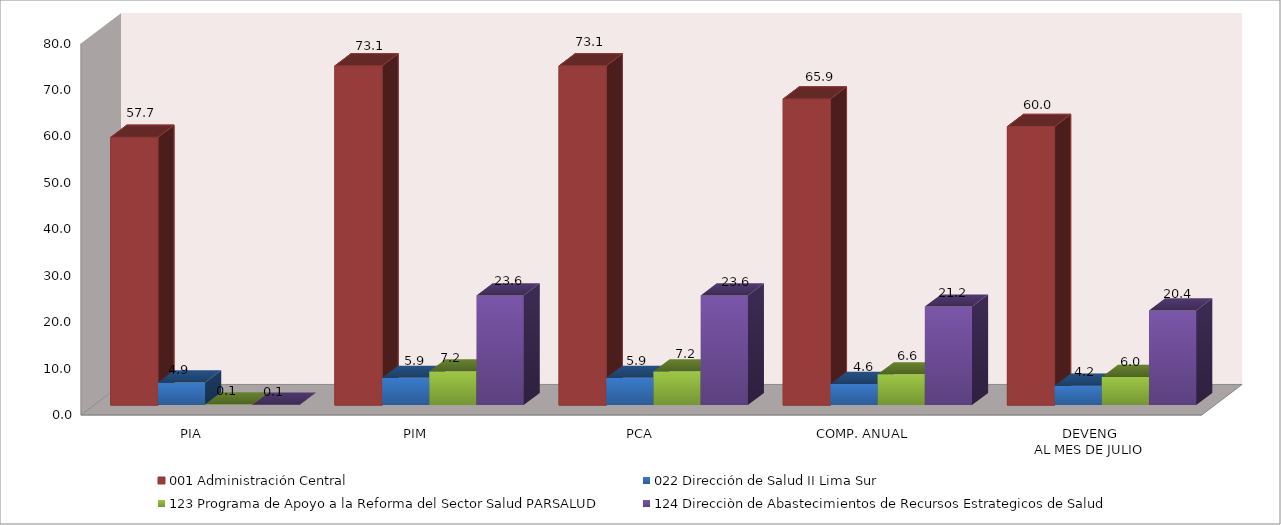
| Category | 001 Administración Central | 022 Dirección de Salud II Lima Sur | 123 Programa de Apoyo a la Reforma del Sector Salud PARSALUD | 124 Direcciòn de Abastecimientos de Recursos Estrategicos de Salud |
|---|---|---|---|---|
| PIA | 57.681 | 4.868 | 0.136 | 0.1 |
| PIM | 73.064 | 5.868 | 7.248 | 23.59 |
| PCA | 73.064 | 5.868 | 7.248 | 23.59 |
| COMP. ANUAL | 65.948 | 4.562 | 6.624 | 21.217 |
| DEVENG
AL MES DE JULIO | 60.004 | 4.159 | 6.041 | 20.36 |